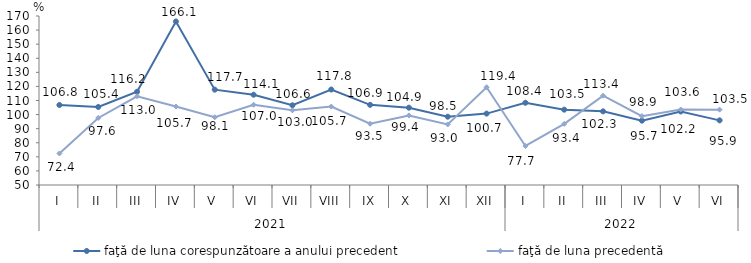
| Category | faţă de luna corespunzătoare a anului precedent | faţă de luna precedentă   |
|---|---|---|
| 0 | 106.8 | 72.4 |
| 1 | 105.4 | 97.6 |
| 2 | 116.2 | 113 |
| 3 | 166.1 | 105.7 |
| 4 | 117.7 | 98.1 |
| 5 | 114.1 | 107 |
| 6 | 106.6 | 103 |
| 7 | 117.8 | 105.7 |
| 8 | 106.9 | 93.5 |
| 9 | 104.9 | 99.4 |
| 10 | 98.5 | 93 |
| 11 | 100.7 | 119.4 |
| 12 | 108.4 | 77.7 |
| 13 | 103.5 | 93.4 |
| 14 | 102.3 | 113.4 |
| 15 | 95.7 | 98.9 |
| 16 | 102.2 | 103.6 |
| 17 | 95.9 | 103.5 |